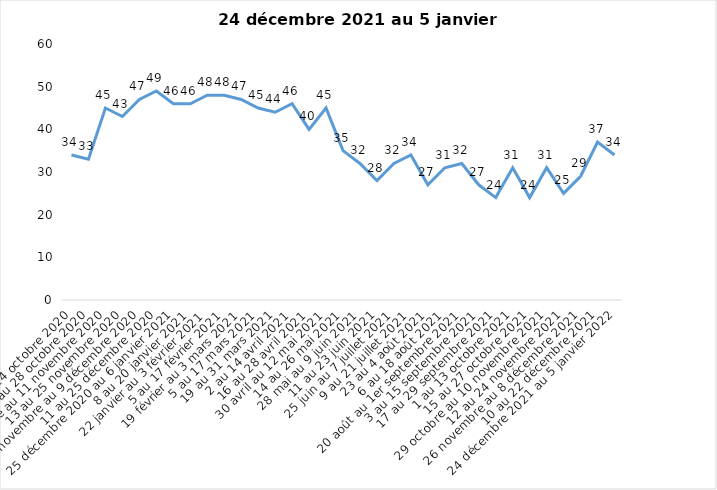
| Category | Toujours aux trois mesures |
|---|---|
| 2 au 14 octobre 2020 | 34 |
| 16 au 28 octobre 2020 | 33 |
| 30 octobre au 11 novembre 2020 | 45 |
| 13 au 25 novembre 2020 | 43 |
| 27 novembre au 9 décembre 2020 | 47 |
| 11 au 25 décembre 2020 | 49 |
| 25 décembre 2020 au 6 janvier 2021 | 46 |
| 8 au 20 janvier 2021 | 46 |
| 22 janvier au 3 février 2021 | 48 |
| 5 au 17 février 2021 | 48 |
| 19 février au 3 mars 2021 | 47 |
| 5 au 17 mars 2021 | 45 |
| 19 au 31 mars 2021 | 44 |
| 2 au 14 avril 2021 | 46 |
| 16 au 28 avril 2021 | 40 |
| 30 avril au 12 mai 2021 | 45 |
| 14 au 26 mai 2021 | 35 |
| 28 mai au 9 juin 2021 | 32 |
| 11 au 23 juin 2021 | 28 |
| 25 juin au 7 juillet 2021 | 32 |
| 9 au 21 juillet 2021 | 34 |
| 23 au 4 août 2021 | 27 |
| 6 au 18 août 2021 | 31 |
| 20 août au 1er septembre 2021 | 32 |
| 3 au 15 septembre 2021 | 27 |
| 17 au 29 septembre 2021 | 24 |
| 1 au 13 octobre 2021 | 31 |
| 15 au 27 octobre 2021 | 24 |
| 29 octobre au 10 novembre 2021 | 31 |
| 12 au 24 novembre 2021 | 25 |
| 26 novembre au 8 décembre 2021 | 29 |
| 10 au 22 décembre 2021 | 37 |
| 24 décembre 2021 au 5 janvier 2022 | 34 |